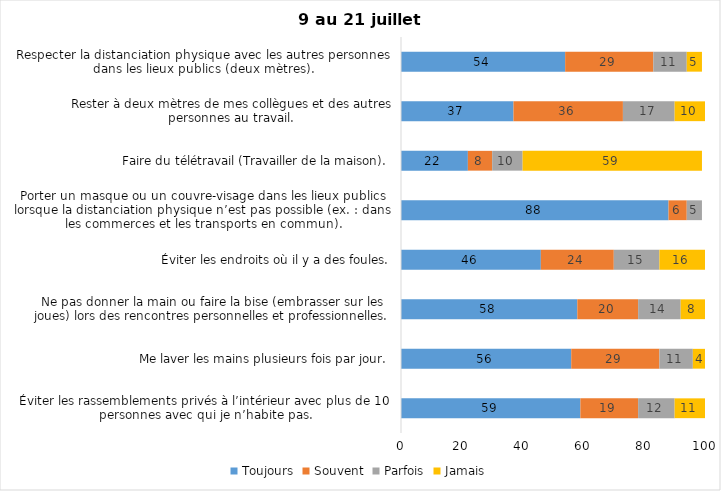
| Category | Toujours | Souvent | Parfois | Jamais |
|---|---|---|---|---|
| Éviter les rassemblements privés à l’intérieur avec plus de 10 personnes avec qui je n’habite pas. | 59 | 19 | 12 | 11 |
| Me laver les mains plusieurs fois par jour. | 56 | 29 | 11 | 4 |
| Ne pas donner la main ou faire la bise (embrasser sur les joues) lors des rencontres personnelles et professionnelles. | 58 | 20 | 14 | 8 |
| Éviter les endroits où il y a des foules. | 46 | 24 | 15 | 16 |
| Porter un masque ou un couvre-visage dans les lieux publics lorsque la distanciation physique n’est pas possible (ex. : dans les commerces et les transports en commun). | 88 | 6 | 5 | 0 |
| Faire du télétravail (Travailler de la maison). | 22 | 8 | 10 | 59 |
| Rester à deux mètres de mes collègues et des autres personnes au travail. | 37 | 36 | 17 | 10 |
| Respecter la distanciation physique avec les autres personnes dans les lieux publics (deux mètres). | 54 | 29 | 11 | 5 |